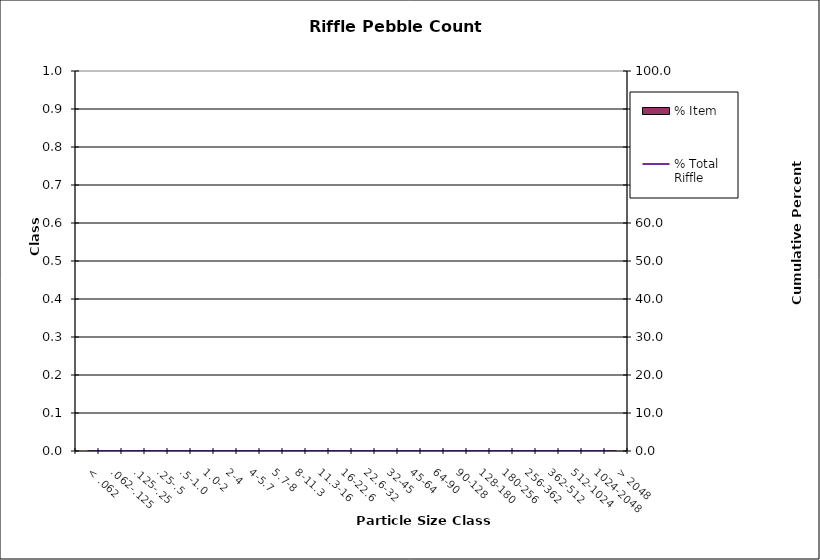
| Category | % Item |
|---|---|
| 0 | 0 |
| 1 | 0 |
| 2 | 0 |
| 3 | 0 |
| 4 | 0 |
| 5 | 0 |
| 6 | 0 |
| 7 | 0 |
| 8 | 0 |
| 9 | 0 |
| 10 | 0 |
| 11 | 0 |
| 12 | 0 |
| 13 | 0 |
| 14 | 0 |
| 15 | 0 |
| 16 | 0 |
| 17 | 0 |
| 18 | 0 |
| 19 | 0 |
| 20 | 0 |
| 21 | 0 |
| 22 | 0 |
| 23 | 0 |